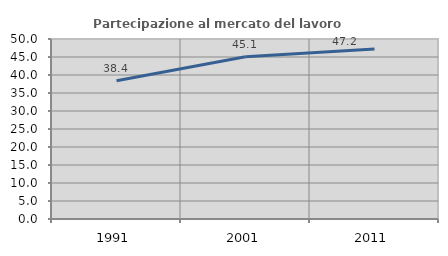
| Category | Partecipazione al mercato del lavoro  femminile |
|---|---|
| 1991.0 | 38.382 |
| 2001.0 | 45.079 |
| 2011.0 | 47.242 |